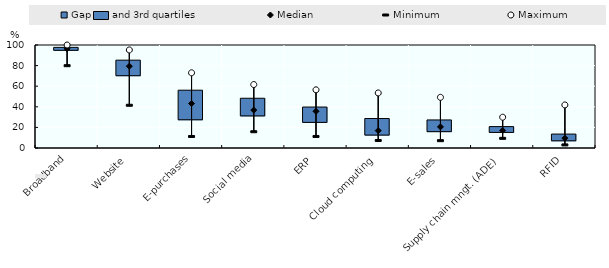
| Category | 1st quartile | Gap 1st and 3rd quartiles |
|---|---|---|
| Broadband | 94.337 | 3.362 |
| Website | 69.697 | 15.578 |
| E-purchases | 26.915 | 29.2 |
| Social media | 30.674 | 17.615 |
| ERP | 24.366 | 15.404 |
| Cloud computing | 12.05 | 16.575 |
| E-sales | 15.397 | 11.847 |
| Supply chain mngt. (ADE) | 14.65 | 6.118 |
| RFID | 6.5 | 7.025 |